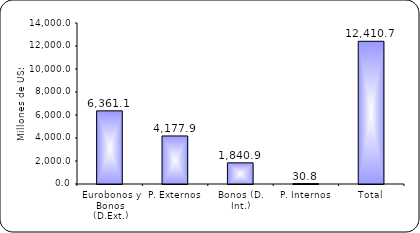
| Category | Series 1 |
|---|---|
| Eurobonos y Bonos (D.Ext.) | 6361.1 |
| P. Externos | 4177.9 |
| Bonos (D. Int.) | 1840.9 |
| P. Internos | 30.8 |
| Total | 12410.7 |